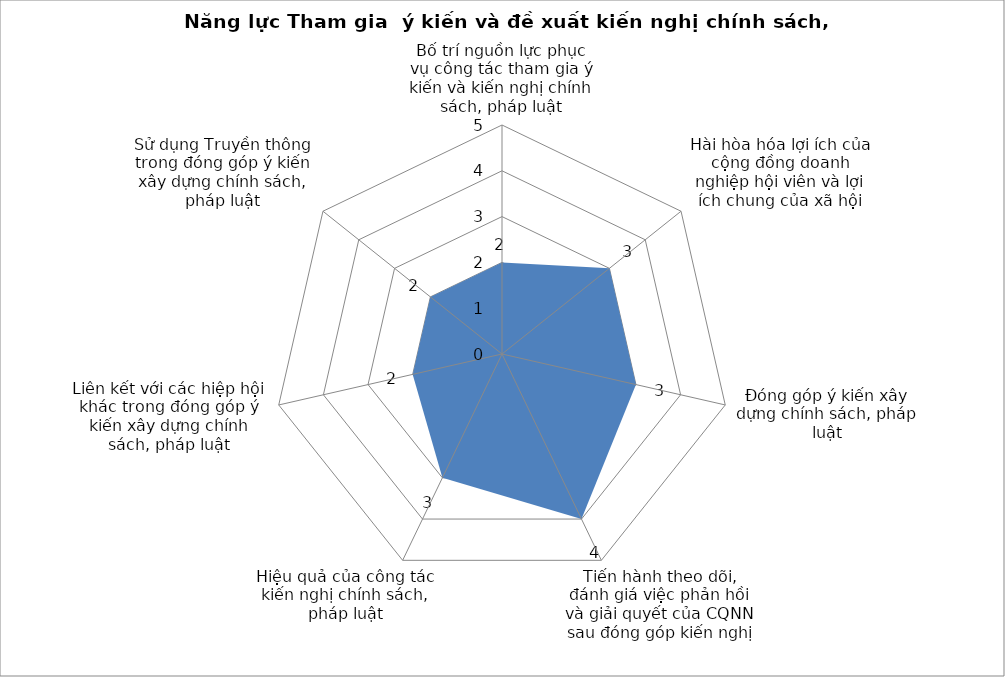
| Category | Series 0 |
|---|---|
| Bố trí nguồn lực phục vụ công tác tham gia ý kiến và kiến nghị chính sách, pháp luật | 2 |
| Hài hòa hóa lợi ích của cộng đồng doanh nghiệp hội viên và lợi ích chung của xã hội | 3 |
| Đóng góp ý kiến xây dựng chính sách, pháp luật | 3 |
| Tiến hành theo dõi, đánh giá việc phản hồi và giải quyết của CQNN sau đóng góp kiến nghị | 4 |
| Hiệu quả của công tác kiến nghị chính sách, pháp luật
 | 3 |
| Liên kết với các hiệp hội khác trong đóng góp ý kiến xây dựng chính sách, pháp luật | 2 |
| Sử dụng Truyền thông trong đóng góp ý kiến xây dựng chính sách, pháp luật | 2 |